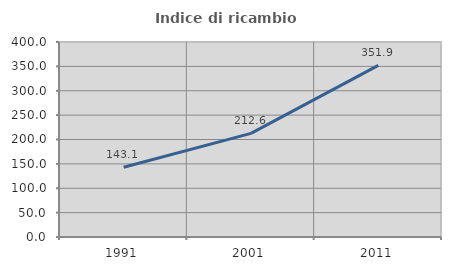
| Category | Indice di ricambio occupazionale  |
|---|---|
| 1991.0 | 143.085 |
| 2001.0 | 212.587 |
| 2011.0 | 351.938 |